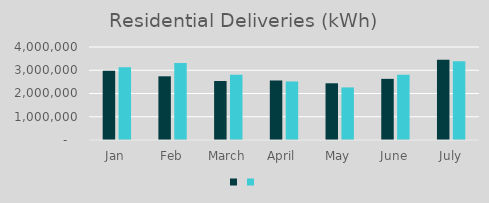
| Category | Series 1 | Series 0 |
|---|---|---|
| Jan | 2975165 | 3124442 |
| Feb | 2739688 | 3307618 |
| March | 2538769 | 2805250 |
| April  | 2560197 | 2517652 |
| May | 2439036 | 2261207 |
| June | 2629934 | 2802052 |
| July | 3456641 | 3385366 |